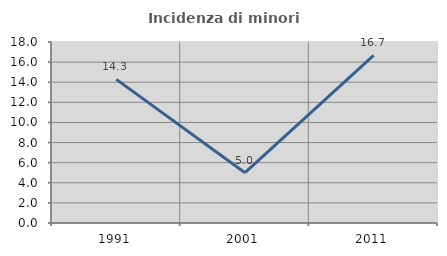
| Category | Incidenza di minori stranieri |
|---|---|
| 1991.0 | 14.286 |
| 2001.0 | 5 |
| 2011.0 | 16.667 |